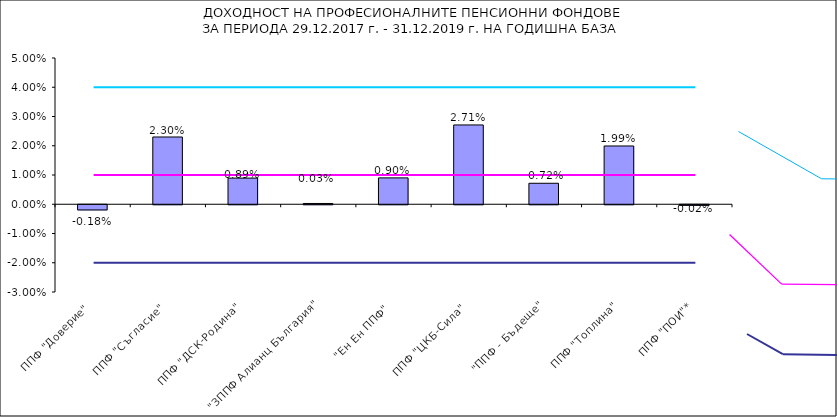
| Category | Series 0 |
|---|---|
| ППФ "Доверие"  | -0.002 |
| ППФ "Съгласие"  | 0.023 |
| ППФ "ДСК-Родина"  | 0.009 |
| "ЗППФ Алианц България"  | 0 |
| "Ен Ен ППФ"  | 0.009 |
| ППФ "ЦКБ-Сила"  | 0.027 |
| "ППФ - Бъдеще" | 0.007 |
| ППФ "Топлина" | 0.02 |
| ППФ "ПОИ"* | 0 |